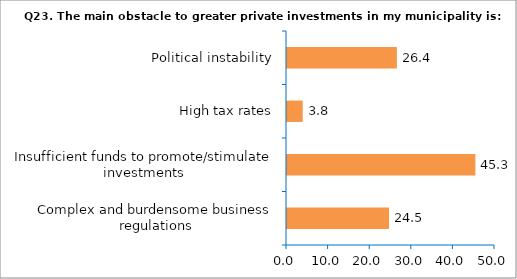
| Category | Series 0 |
|---|---|
| Complex and burdensome business regulations | 24.528 |
| Insufficient funds to promote/stimulate investments | 45.283 |
| High tax rates | 3.774 |
| Political instability | 26.415 |